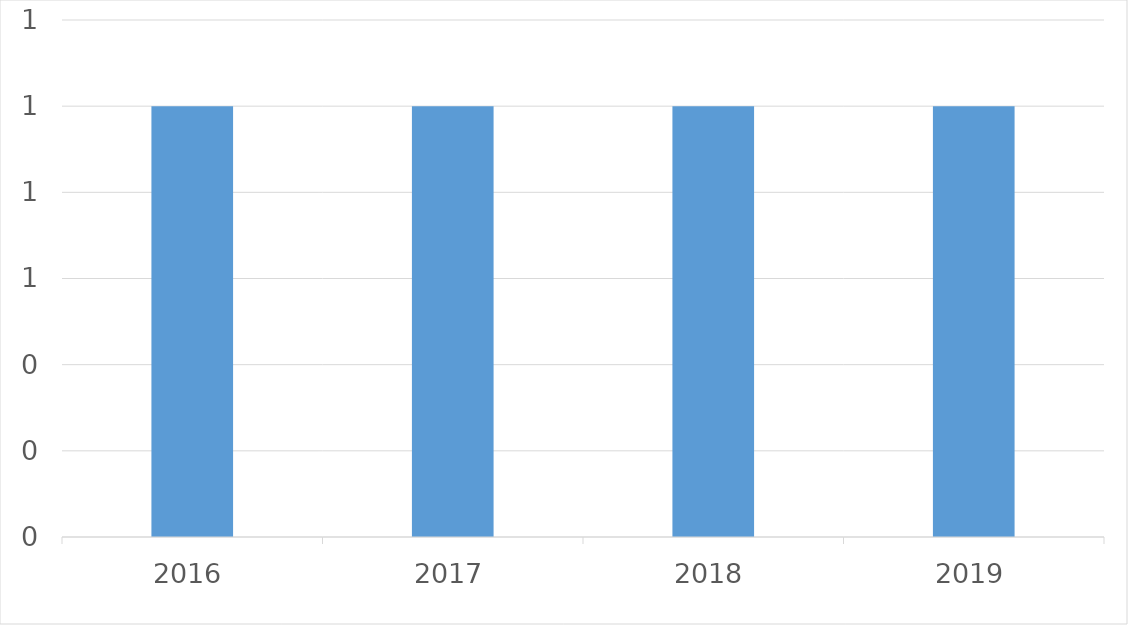
| Category | Series 0 |
|---|---|
| 2016 | 1 |
| 2017 | 1 |
| 2018 | 1 |
| 2019 | 1 |